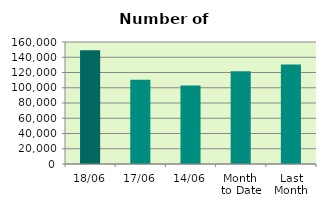
| Category | Series 0 |
|---|---|
| 18/06 | 149266 |
| 17/06 | 110434 |
| 14/06 | 102944 |
| Month 
to Date | 121698.667 |
| Last
Month | 130647.636 |